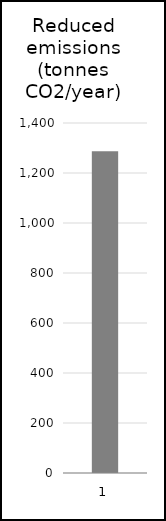
| Category | Annual emissions reduction if selected ERS section is electrified (tonnes CO2) |
|---|---|
| 0 | 1286.625 |